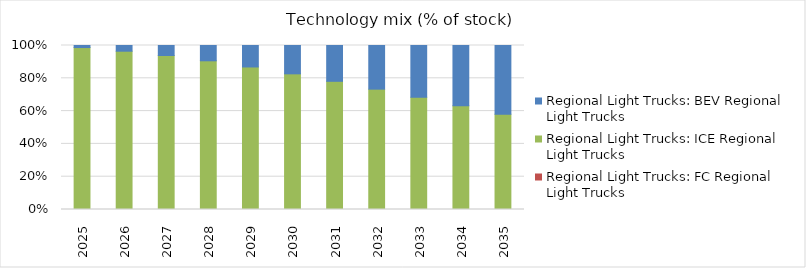
| Category | Regional Light Trucks: FC Regional Light Trucks | Regional Light Trucks: ICE Regional Light Trucks | Regional Light Trucks: BEV Regional Light Trucks |
|---|---|---|---|
| 2025.0 | 0 | 0.988 | 0.012 |
| 2026.0 | 0 | 0.965 | 0.035 |
| 2027.0 | 0 | 0.939 | 0.061 |
| 2028.0 | 0 | 0.907 | 0.093 |
| 2029.0 | 0 | 0.869 | 0.131 |
| 2030.0 | 0 | 0.827 | 0.173 |
| 2031.0 | 0 | 0.782 | 0.218 |
| 2032.0 | 0 | 0.734 | 0.266 |
| 2033.0 | 0 | 0.684 | 0.316 |
| 2034.0 | 0 | 0.633 | 0.367 |
| 2035.0 | 0 | 0.58 | 0.42 |